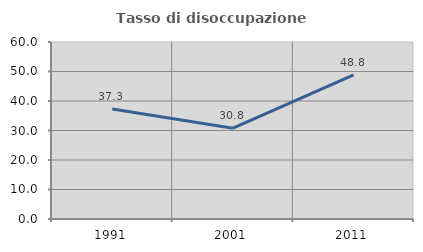
| Category | Tasso di disoccupazione giovanile  |
|---|---|
| 1991.0 | 37.255 |
| 2001.0 | 30.769 |
| 2011.0 | 48.837 |